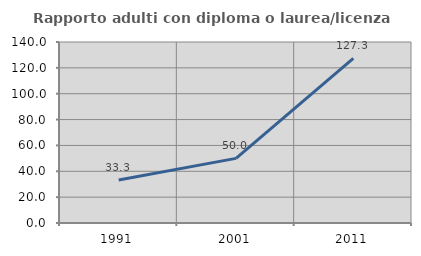
| Category | Rapporto adulti con diploma o laurea/licenza media  |
|---|---|
| 1991.0 | 33.333 |
| 2001.0 | 50 |
| 2011.0 | 127.273 |